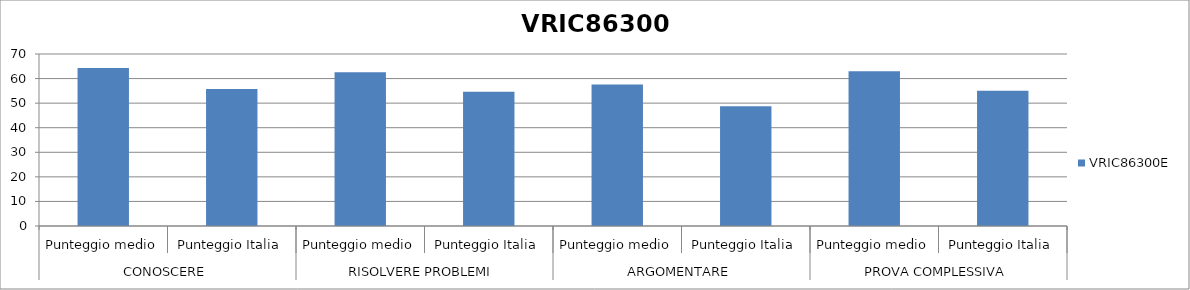
| Category | VRIC86300E |
|---|---|
| 0 | 64.3 |
| 1 | 55.8 |
| 2 | 62.6 |
| 3 | 54.6 |
| 4 | 57.6 |
| 5 | 48.7 |
| 6 | 63 |
| 7 | 55 |